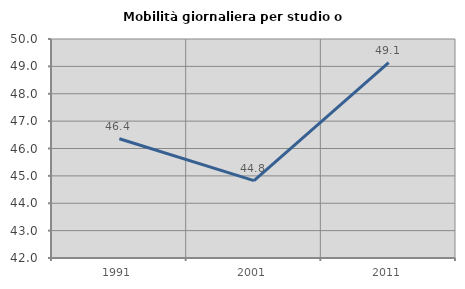
| Category | Mobilità giornaliera per studio o lavoro |
|---|---|
| 1991.0 | 46.357 |
| 2001.0 | 44.828 |
| 2011.0 | 49.138 |